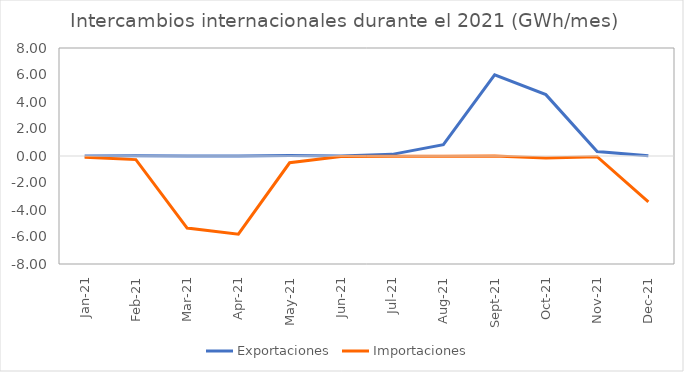
| Category | Exportaciones | Importaciones  |
|---|---|---|
| 2021-01-01 | 0.007 | -0.097 |
| 2021-02-01 | 0.027 | -0.267 |
| 2021-03-01 | 0.004 | -5.34 |
| 2021-04-01 | 0.001 | -5.794 |
| 2021-05-01 | 0.036 | -0.502 |
| 2021-06-01 | 0.005 | -0.039 |
| 2021-07-01 | 0.122 | -0.025 |
| 2021-08-01 | 0.835 | -0.02 |
| 2021-09-01 | 6.017 | -0.003 |
| 2021-10-01 | 4.546 | -0.139 |
| 2021-11-01 | 0.33 | -0.049 |
| 2021-12-01 | 0.012 | -3.406 |